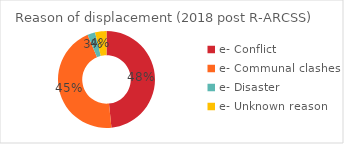
| Category | Series 0 |
|---|---|
| e- Conflict | 66099 |
| e- Communal clashes | 61843 |
| e- Disaster | 3534 |
| e- Unknown reason | 5179 |